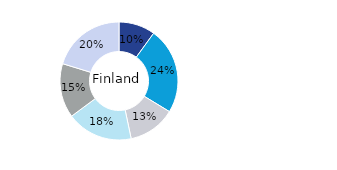
| Category | Finland |
|---|---|
| Office | 0.1 |
| Residential | 0.237 |
| Retail | 0.13 |
| Logistics* | 0.182 |
| Public Sector** | 0.149 |
| Other | 0.203 |